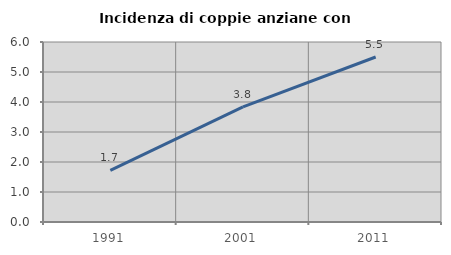
| Category | Incidenza di coppie anziane con figli |
|---|---|
| 1991.0 | 1.724 |
| 2001.0 | 3.836 |
| 2011.0 | 5.5 |